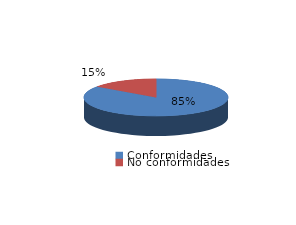
| Category | Series 0 |
|---|---|
| Conformidades | 680 |
| No conformidades | 121 |